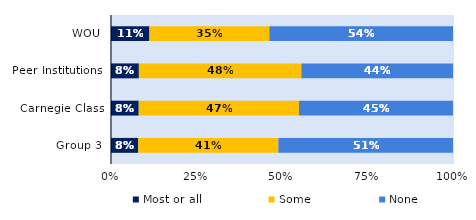
| Category | Most or all | Some | None |
|---|---|---|---|
| WOU | 0.112 | 0.351 | 0.537 |
| Peer Institutions | 0.081 | 0.475 | 0.443 |
| Carnegie Class | 0.081 | 0.469 | 0.45 |
| Group 3 | 0.08 | 0.41 | 0.511 |